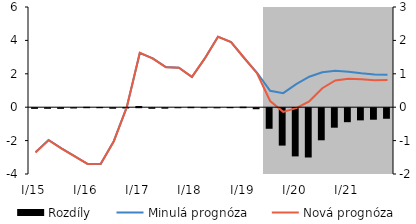
| Category | Rozdíly |
|---|---|
| I/15 | -0.02 |
| II | -0.018 |
| III | -0.02 |
| IV | -0.009 |
| I/16 | 0.012 |
| II | 0.007 |
| III | -0.016 |
| IV | -0.008 |
| I/17 | 0.035 |
| II | -0.018 |
| III | -0.015 |
| IV | -0.001 |
| I/18 | 0.011 |
| II | -0.002 |
| III | -0.003 |
| IV | 0.006 |
| I/19 | 0.016 |
| II | -0.031 |
| III | -0.616 |
| IV | -1.12 |
| I/20 | -1.443 |
| II | -1.476 |
| III | -0.961 |
| IV | -0.584 |
| I/21 | -0.419 |
| II | -0.364 |
| III | -0.345 |
| IV | -0.316 |